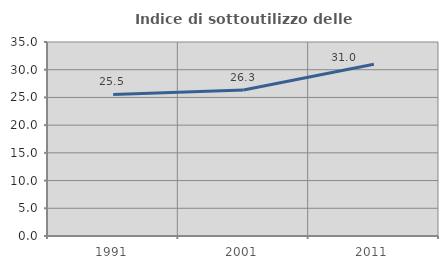
| Category | Indice di sottoutilizzo delle abitazioni  |
|---|---|
| 1991.0 | 25.532 |
| 2001.0 | 26.336 |
| 2011.0 | 30.992 |